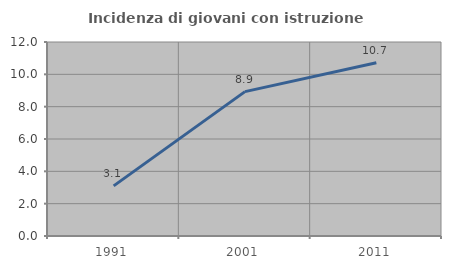
| Category | Incidenza di giovani con istruzione universitaria |
|---|---|
| 1991.0 | 3.101 |
| 2001.0 | 8.929 |
| 2011.0 | 10.714 |